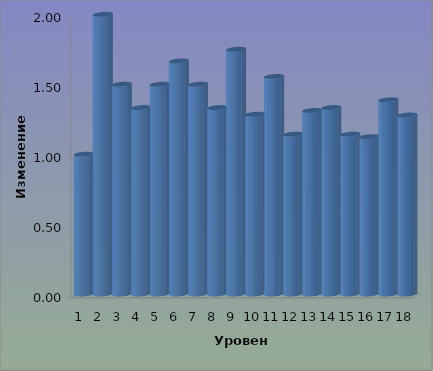
| Category | Series 0 |
|---|---|
| 0 | 1 |
| 1 | 2 |
| 2 | 1.5 |
| 3 | 1.333 |
| 4 | 1.5 |
| 5 | 1.667 |
| 6 | 1.5 |
| 7 | 1.333 |
| 8 | 1.75 |
| 9 | 1.286 |
| 10 | 1.556 |
| 11 | 1.143 |
| 12 | 1.312 |
| 13 | 1.333 |
| 14 | 1.143 |
| 15 | 1.125 |
| 16 | 1.389 |
| 17 | 1.28 |